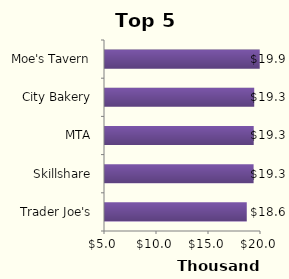
| Category | Final Amount  |
|---|---|
| Trader Joe's | 18631.779 |
| Skillshare | 19288.295 |
| MTA | 19300.271 |
| City Bakery | 19348.176 |
| Moe's Tavern | 19877.309 |